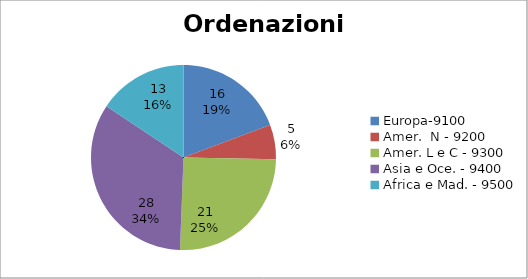
| Category | Series 0 |
|---|---|
| Europa-9100 | 16 |
| Amer.  N - 9200 | 5 |
| Amer. L e C - 9300 | 21 |
| Asia e Oce. - 9400 | 28 |
| Africa e Mad. - 9500 | 13 |